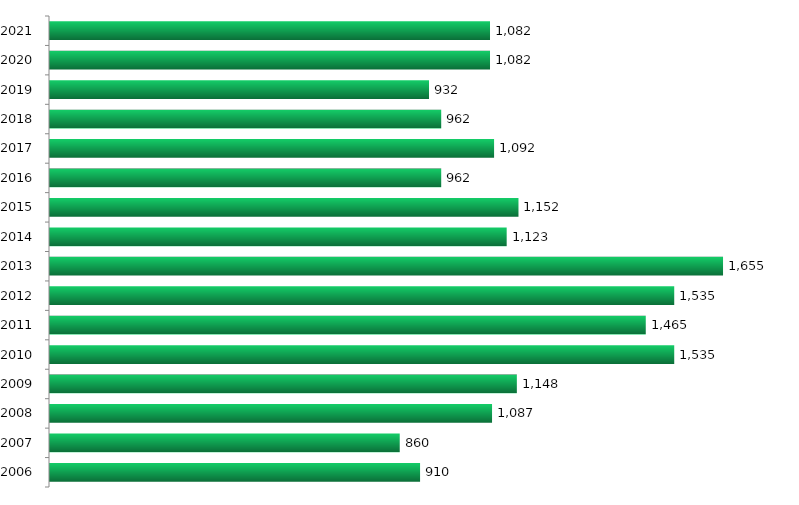
| Category | Vagas |
|---|---|
| 2006.0 | 910 |
| 2007.0 | 860 |
| 2008.0 | 1087 |
| 2009.0 | 1148 |
| 2010.0 | 1535 |
| 2011.0 | 1465 |
| 2012.0 | 1535 |
| 2013.0 | 1655 |
| 2014.0 | 1123 |
| 2015.0 | 1152 |
| 2016.0 | 962 |
| 2017.0 | 1092 |
| 2018.0 | 962 |
| 2019.0 | 932 |
| 2020.0 | 1082 |
| 2021.0 | 1082 |